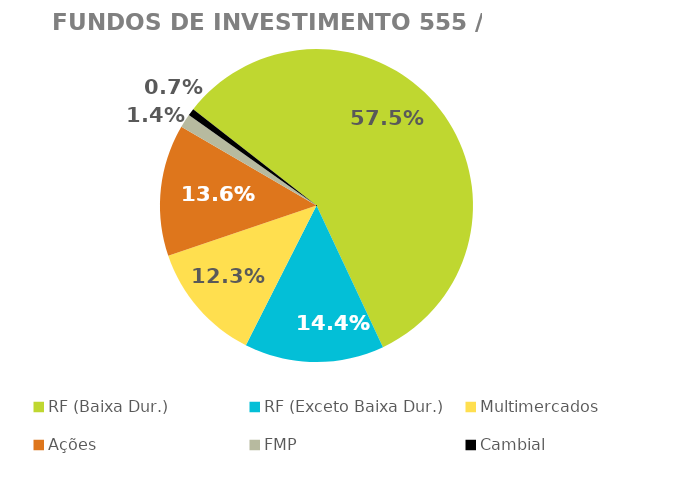
| Category | Fundos de Investimento 555 / FMP |
|---|---|
| RF (Baixa Dur.) | 0.575 |
| RF (Exceto Baixa Dur.) | 0.144 |
| Multimercados | 0.123 |
| Ações | 0.136 |
| FMP | 0.014 |
| Cambial | 0.007 |